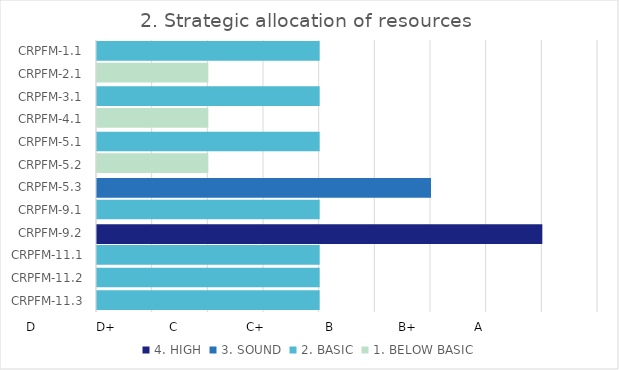
| Category | 4. HIGH | 3. SOUND | 2. BASIC | 1. BELOW BASIC |
|---|---|---|---|---|
| CRPFM-11.3 | 0 | 0 | 2 | 0 |
| CRPFM-11.2 | 0 | 0 | 2 | 0 |
| CRPFM-11.1 | 0 | 0 | 2 | 0 |
| CRPFM-9.2 | 4 | 0 | 0 | 0 |
| CRPFM-9.1 | 0 | 0 | 2 | 0 |
| CRPFM-5.3 | 0 | 3 | 0 | 0 |
| CRPFM-5.2 | 0 | 0 | 0 | 1 |
| CRPFM-5.1 | 0 | 0 | 2 | 0 |
| CRPFM-4.1 | 0 | 0 | 0 | 1 |
| CRPFM-3.1 | 0 | 0 | 2 | 0 |
| CRPFM-2.1 | 0 | 0 | 0 | 1 |
| CRPFM-1.1 | 0 | 0 | 2 | 0 |